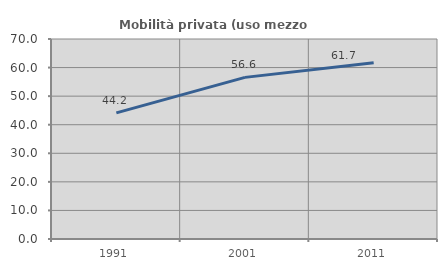
| Category | Mobilità privata (uso mezzo privato) |
|---|---|
| 1991.0 | 44.155 |
| 2001.0 | 56.566 |
| 2011.0 | 61.71 |